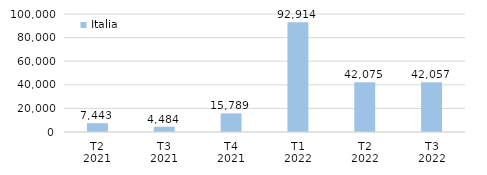
| Category | Italia |
|---|---|
| T2
2021 | 7443.22 |
| T3
2021 | 4484.196 |
| T4
2021 | 15789.152 |
| T1
2022 | 92913.756 |
| T2
2022 | 42075.209 |
| T3
2022 | 42056.837 |